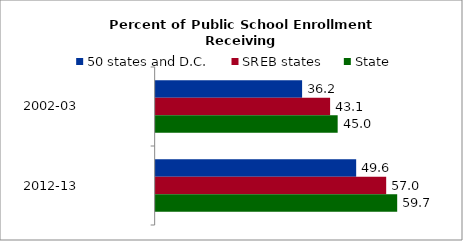
| Category | 50 states and D.C. | SREB states | State |
|---|---|---|---|
| 2002-03 | 36.206 | 43.131 | 45 |
| 2012-13 | 49.575 | 56.996 | 59.718 |